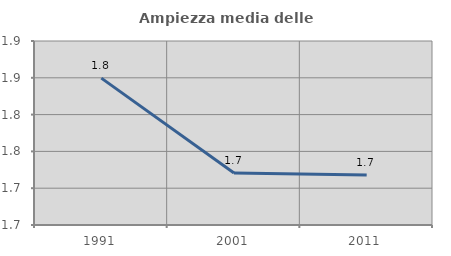
| Category | Ampiezza media delle famiglie |
|---|---|
| 1991.0 | 1.85 |
| 2001.0 | 1.721 |
| 2011.0 | 1.718 |